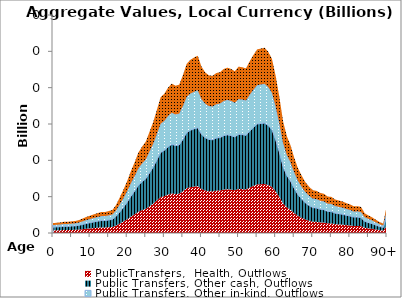
| Category | PublicTransfers,  Health, Outflows | Public Transfers, Other cash, Outflows | Public Transfers, Other in-kind, Outflows | Public Transfers, Education, Outflows |
|---|---|---|---|---|
| 0 | 0.36 | 0.447 | 0.288 | 0.265 |
|  | 0.373 | 0.463 | 0.298 | 0.274 |
| 2 | 0.387 | 0.481 | 0.31 | 0.285 |
| 3 | 0.409 | 0.508 | 0.327 | 0.301 |
| 4 | 0.412 | 0.511 | 0.329 | 0.303 |
| 5 | 0.424 | 0.527 | 0.339 | 0.312 |
| 6 | 0.438 | 0.544 | 0.35 | 0.322 |
| 7 | 0.472 | 0.586 | 0.378 | 0.347 |
| 8 | 0.528 | 0.655 | 0.422 | 0.388 |
| 9 | 0.588 | 0.729 | 0.47 | 0.432 |
| 10 | 0.631 | 0.783 | 0.505 | 0.464 |
| 11 | 0.681 | 0.845 | 0.544 | 0.501 |
| 12 | 0.723 | 0.898 | 0.578 | 0.532 |
| 13 | 0.764 | 0.948 | 0.611 | 0.562 |
| 14 | 0.765 | 0.95 | 0.612 | 0.563 |
| 15 | 0.799 | 0.992 | 0.639 | 0.588 |
| 16 | 0.838 | 1.04 | 0.67 | 0.616 |
| 17 | 1.023 | 1.27 | 0.818 | 0.752 |
| 18 | 1.298 | 1.611 | 1.038 | 0.955 |
| 19 | 1.584 | 1.966 | 1.267 | 1.165 |
| 20 | 1.898 | 2.356 | 1.518 | 1.396 |
| 21 | 2.258 | 2.802 | 1.806 | 1.661 |
| 22 | 2.575 | 3.197 | 2.06 | 1.894 |
| 23 | 2.932 | 3.639 | 2.345 | 2.156 |
| 24 | 3.146 | 3.905 | 2.516 | 2.314 |
| 25 | 3.329 | 4.133 | 2.663 | 2.449 |
| 26 | 3.685 | 4.574 | 2.947 | 2.711 |
| 27 | 4.043 | 5.019 | 3.234 | 2.974 |
| 28 | 4.491 | 5.574 | 3.592 | 3.303 |
| 29 | 4.943 | 6.136 | 3.953 | 3.636 |
| 30 | 5.076 | 6.301 | 4.06 | 3.734 |
| 31 | 5.294 | 6.572 | 4.234 | 3.894 |
| 32 | 5.444 | 6.758 | 4.354 | 4.004 |
| 33 | 5.368 | 6.663 | 4.293 | 3.948 |
| 34 | 5.404 | 6.708 | 4.322 | 3.975 |
| 35 | 5.748 | 7.136 | 4.597 | 4.228 |
| 36 | 6.158 | 7.644 | 4.925 | 4.529 |
| 37 | 6.309 | 7.831 | 5.045 | 4.64 |
| 38 | 6.393 | 7.936 | 5.113 | 4.703 |
| 39 | 6.46 | 8.019 | 5.167 | 4.752 |
| 40 | 6.065 | 7.529 | 4.851 | 4.461 |
| 41 | 5.854 | 7.267 | 4.682 | 4.306 |
| 42 | 5.745 | 7.131 | 4.595 | 4.226 |
| 43 | 5.727 | 7.109 | 4.58 | 4.213 |
| 44 | 5.829 | 7.236 | 4.662 | 4.287 |
| 45 | 5.859 | 7.273 | 4.686 | 4.31 |
| 46 | 5.975 | 7.417 | 4.779 | 4.395 |
| 47 | 6.025 | 7.479 | 4.819 | 4.432 |
| 48 | 5.976 | 7.419 | 4.78 | 4.396 |
| 49 | 5.894 | 7.316 | 4.713 | 4.335 |
| 50 | 6.062 | 7.525 | 4.848 | 4.459 |
| 51 | 6.04 | 7.498 | 4.831 | 4.443 |
| 52 | 5.998 | 7.446 | 4.797 | 4.412 |
| 53 | 6.257 | 7.766 | 5.004 | 4.602 |
| 54 | 6.486 | 8.052 | 5.188 | 4.771 |
| 55 | 6.69 | 8.304 | 5.35 | 4.921 |
| 56 | 6.721 | 8.343 | 5.375 | 4.944 |
| 57 | 6.752 | 8.382 | 5.4 | 4.967 |
| 58 | 6.605 | 8.199 | 5.283 | 4.859 |
| 59 | 6.345 | 7.876 | 5.075 | 4.667 |
| 60 | 5.724 | 7.105 | 4.578 | 4.21 |
| 61 | 4.955 | 6.151 | 3.963 | 3.645 |
| 62 | 4.07 | 5.052 | 3.255 | 2.994 |
| 63 | 3.534 | 4.387 | 2.826 | 2.599 |
| 64 | 3.197 | 3.968 | 2.557 | 2.351 |
| 65 | 2.744 | 3.406 | 2.194 | 2.018 |
| 66 | 2.361 | 2.931 | 1.888 | 1.737 |
| 67 | 2.095 | 2.601 | 1.675 | 1.541 |
| 68 | 1.851 | 2.298 | 1.481 | 1.362 |
| 69 | 1.689 | 2.096 | 1.35 | 1.242 |
| 70 | 1.56 | 1.936 | 1.247 | 1.147 |
| 71 | 1.535 | 1.905 | 1.228 | 1.129 |
| 72 | 1.463 | 1.816 | 1.17 | 1.076 |
| 73 | 1.43 | 1.775 | 1.143 | 1.052 |
| 74 | 1.33 | 1.65 | 1.063 | 0.978 |
| 75 | 1.316 | 1.634 | 1.053 | 0.968 |
| 76 | 1.223 | 1.518 | 0.978 | 0.9 |
| 77 | 1.185 | 1.47 | 0.947 | 0.871 |
| 78 | 1.151 | 1.428 | 0.92 | 0.846 |
| 79 | 1.09 | 1.354 | 0.872 | 0.802 |
| 80 | 1.045 | 1.298 | 0.836 | 0.769 |
| 81 | 0.976 | 1.212 | 0.781 | 0.718 |
| 82 | 0.979 | 1.216 | 0.783 | 0.72 |
| 83 | 0.95 | 1.18 | 0.76 | 0.699 |
| 84 | 0.716 | 0.889 | 0.573 | 0.527 |
| 85 | 0.64 | 0.795 | 0.512 | 0.471 |
| 86 | 0.57 | 0.708 | 0.456 | 0.419 |
| 87 | 0.483 | 0.599 | 0.386 | 0.355 |
| 88 | 0.399 | 0.496 | 0.319 | 0.294 |
| 89 | 0.341 | 0.423 | 0.273 | 0.251 |
| 90+ | 1.056 | 1.311 | 0.845 | 0.777 |